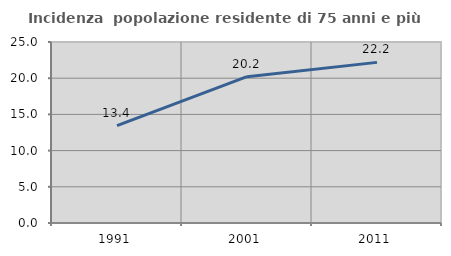
| Category | Incidenza  popolazione residente di 75 anni e più |
|---|---|
| 1991.0 | 13.449 |
| 2001.0 | 20.207 |
| 2011.0 | 22.186 |